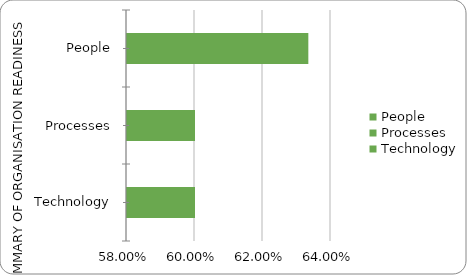
| Category | Series 0 |
|---|---|
| People | 0.633 |
| Processes | 0.6 |
| Technology | 0.6 |